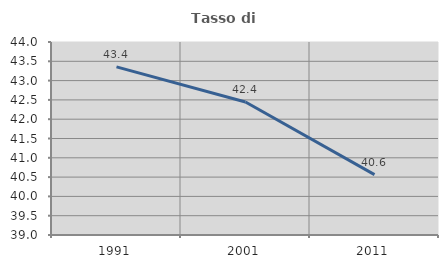
| Category | Tasso di occupazione   |
|---|---|
| 1991.0 | 43.356 |
| 2001.0 | 42.444 |
| 2011.0 | 40.565 |